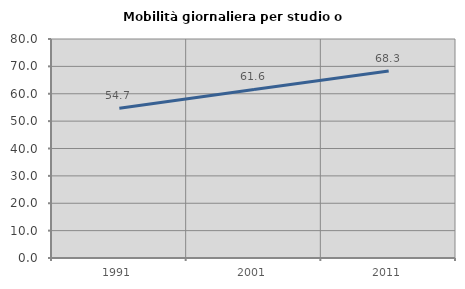
| Category | Mobilità giornaliera per studio o lavoro |
|---|---|
| 1991.0 | 54.669 |
| 2001.0 | 61.56 |
| 2011.0 | 68.293 |